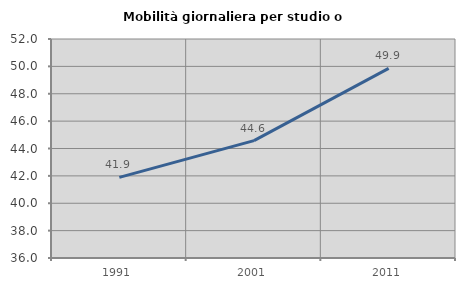
| Category | Mobilità giornaliera per studio o lavoro |
|---|---|
| 1991.0 | 41.892 |
| 2001.0 | 44.573 |
| 2011.0 | 49.855 |